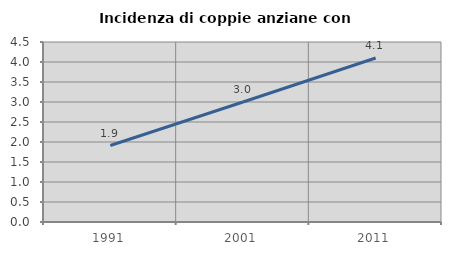
| Category | Incidenza di coppie anziane con figli |
|---|---|
| 1991.0 | 1.912 |
| 2001.0 | 3.001 |
| 2011.0 | 4.099 |